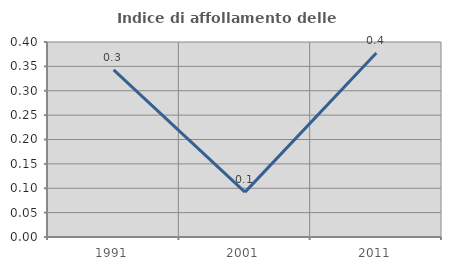
| Category | Indice di affollamento delle abitazioni  |
|---|---|
| 1991.0 | 0.343 |
| 2001.0 | 0.092 |
| 2011.0 | 0.377 |